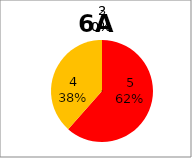
| Category | Series 0 |
|---|---|
| 5.0 | 8 |
| 4.0 | 5 |
| 3.0 | 0 |
| 2.0 | 0 |